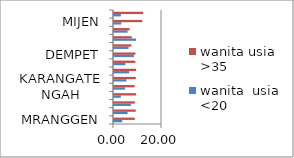
| Category | wanita  | wanita |
|---|---|---|
| MRANGGEN | 3.443 | 8.663 |
| KARANGAWEN  | 5.664 | 9.049 |
| GUNTUR | 7.047 | 8.712 |
| SAYUNG | 2.834 | 9.198 |
| KARANGATENGAH | 4.61 | 8.585 |
| BONANG | 5.231 | 9.105 |
| DEMAK | 6.272 | 9.179 |
| WONOSALAM | 4.722 | 8.879 |
| DEMPET | 8.28 | 8.917 |
| KEBONAGUNG | 6.047 | 7.227 |
| GAJAH | 9.171 | 7.403 |
| KARANGANYAR | 5.662 | 6.503 |
| MIJEN | 3.05 | 11.738 |
| WEDUNG | 2.859 | 12.181 |